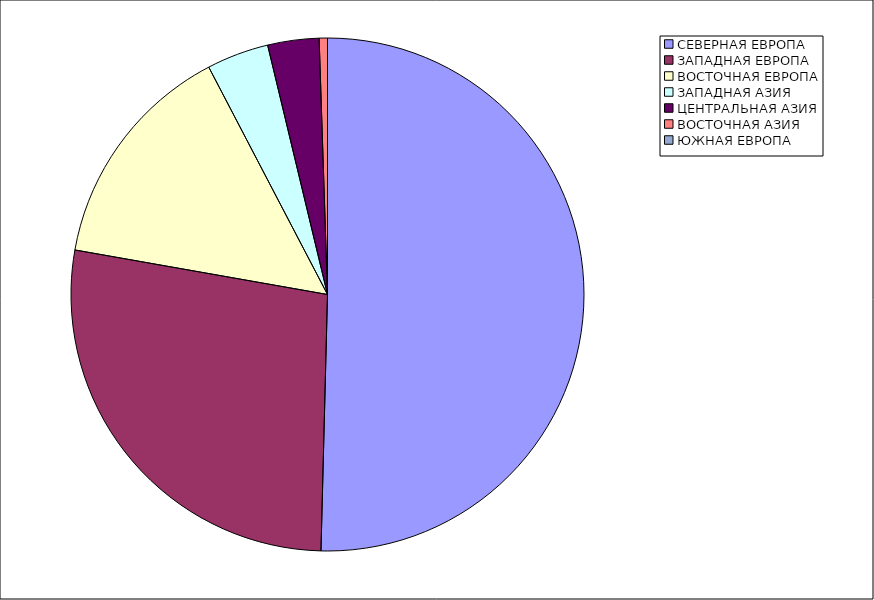
| Category | Оборот |
|---|---|
| СЕВЕРНАЯ ЕВРОПА | 50.4 |
| ЗАПАДНАЯ ЕВРОПА | 27.37 |
| ВОСТОЧНАЯ ЕВРОПА | 14.56 |
| ЗАПАДНАЯ АЗИЯ | 3.91 |
| ЦЕНТРАЛЬНАЯ АЗИЯ | 3.23 |
| ВОСТОЧНАЯ АЗИЯ | 0.52 |
| ЮЖНАЯ ЕВРОПА | 0 |